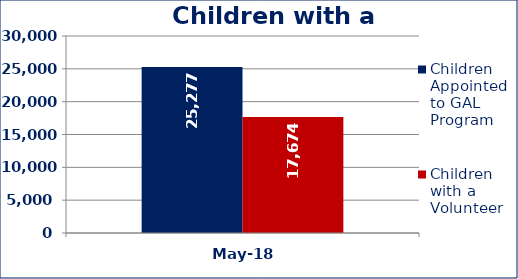
| Category | Children Appointed to GAL Program  | Children with a Volunteer  |
|---|---|---|
| May-18 | 25277 | 17674 |